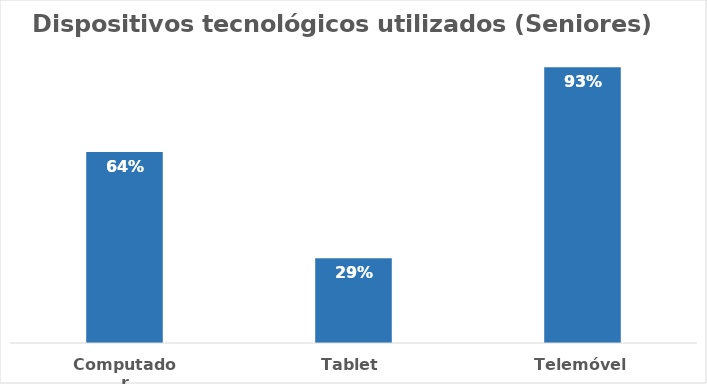
| Category | Series 0 |
|---|---|
| Computador | 0.643 |
| Tablet | 0.286 |
| Telemóvel | 0.929 |